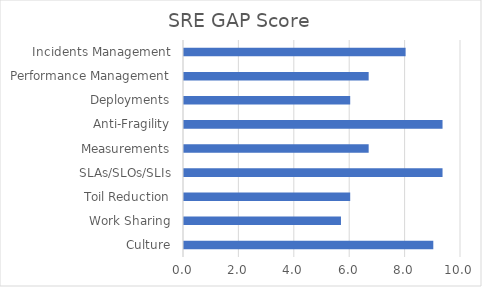
| Category | SRE GAP Score |
|---|---|
| Culture | 9 |
| Work Sharing | 5.667 |
| Toil Reduction | 6 |
| SLAs/SLOs/SLIs | 9.333 |
| Measurements | 6.667 |
| Anti-Fragility | 9.333 |
| Deployments | 6 |
| Performance Management | 6.667 |
| Incidents Management | 8 |